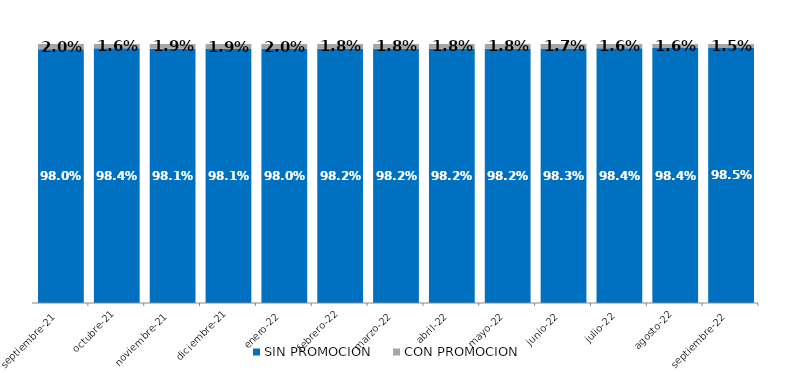
| Category | SIN PROMOCION   | CON PROMOCION   |
|---|---|---|
| 2021-09-01 | 0.98 | 0.02 |
| 2021-10-01 | 0.984 | 0.016 |
| 2021-11-01 | 0.981 | 0.019 |
| 2021-12-01 | 0.981 | 0.019 |
| 2022-01-01 | 0.98 | 0.02 |
| 2022-02-01 | 0.982 | 0.018 |
| 2022-03-01 | 0.982 | 0.018 |
| 2022-04-01 | 0.982 | 0.018 |
| 2022-05-01 | 0.982 | 0.018 |
| 2022-06-01 | 0.983 | 0.017 |
| 2022-07-01 | 0.984 | 0.016 |
| 2022-08-01 | 0.984 | 0.016 |
| 2022-09-01 | 0.985 | 0.015 |